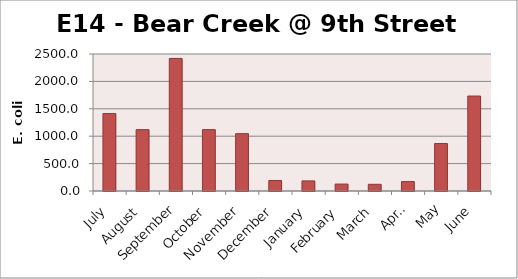
| Category | E. coli MPN |
|---|---|
| July | 1413.6 |
| August | 1119.9 |
| September | 2419.2 |
| October | 1119.9 |
| November | 1046.2 |
| December | 191.8 |
| January | 184.2 |
| February | 126.7 |
| March | 122.3 |
| April | 172.5 |
| May | 866.4 |
| June | 1732.9 |